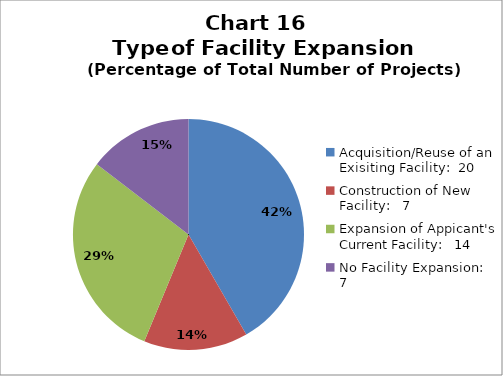
| Category | Series 0 | Series 1 |
|---|---|---|
| Acquisition/Reuse of an Exisiting Facility:  20 | 20 | 0.417 |
| Construction of New Facility:   7 | 7 | 0.146 |
| Expansion of Appicant's Current Facility:   14 | 14 | 0.292 |
| No Facility Expansion:   7 | 7 | 0.146 |